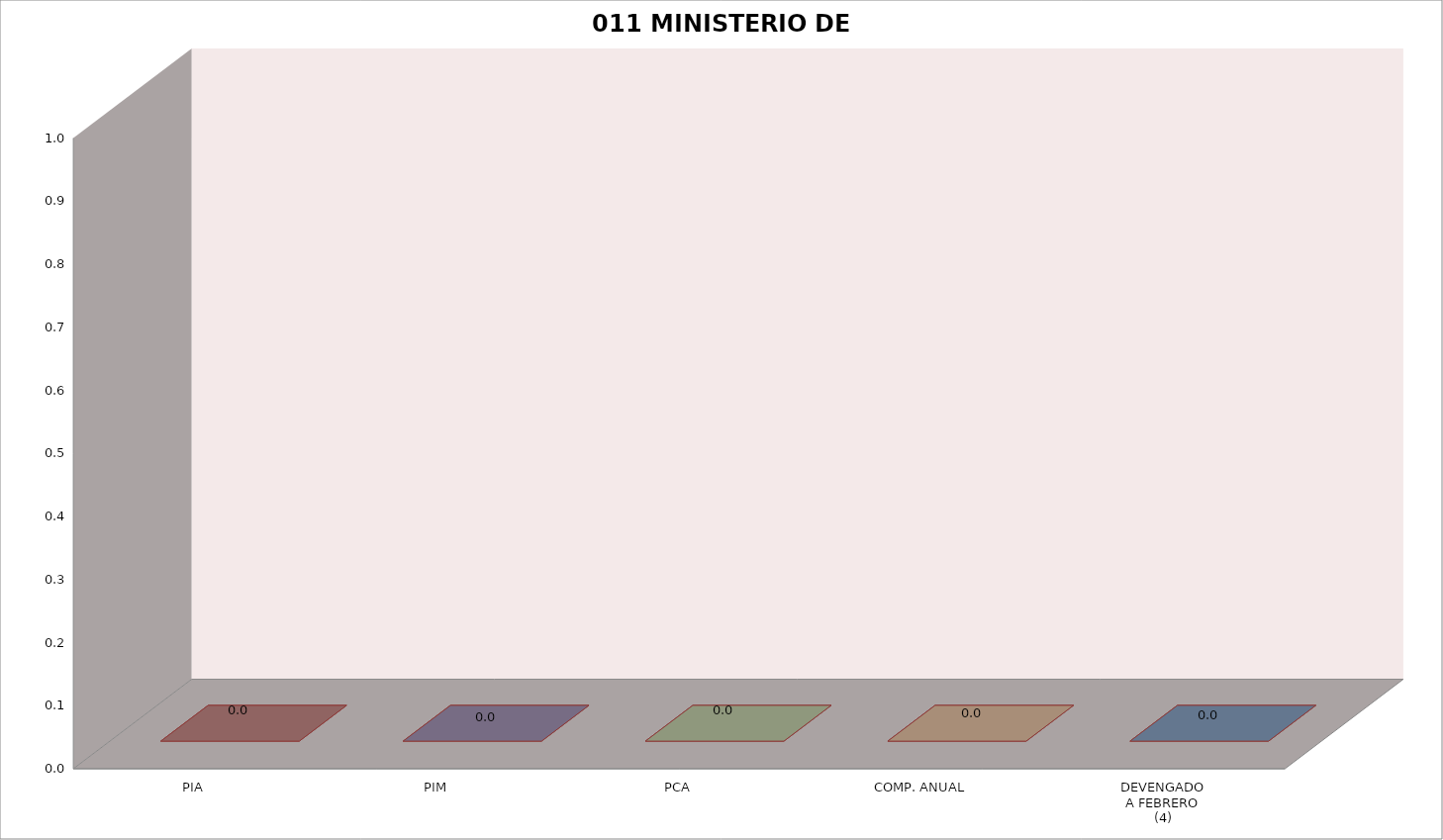
| Category | 011 MINISTERIO DE SALUD |
|---|---|
| PIA | 0 |
| PIM | 0 |
| PCA | 0 |
| COMP. ANUAL | 0 |
| DEVENGADO
A FEBRERO
(4) | 0 |